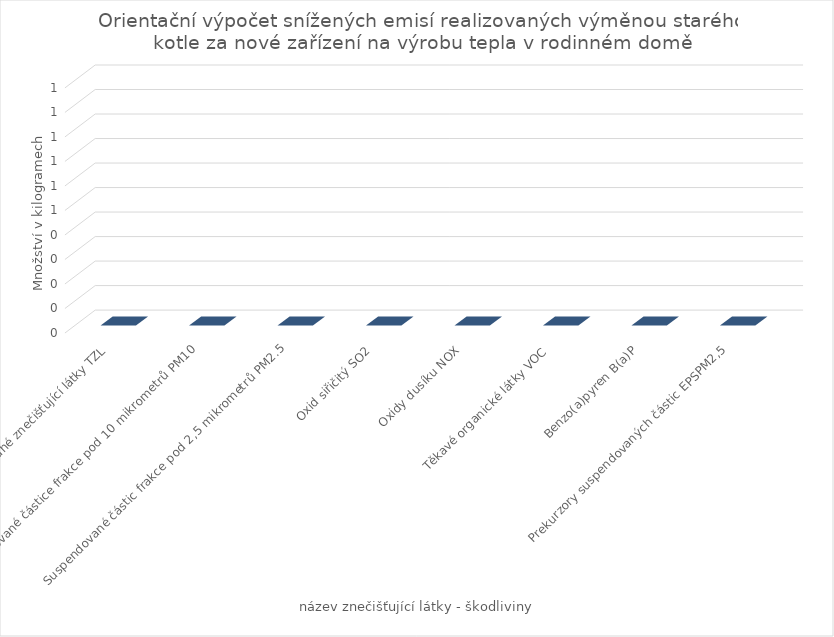
| Category | Series 0 |
|---|---|
| Tuhé znečišťující látky TZL | 0 |
| Suspendované částice frakce pod 10 mikrometrů PM10 | 0 |
| Suspendované částic frakce pod 2,5 mikrometrů PM2.5 | 0 |
| Oxid siřičitý SO2 | 0 |
| Oxidy dusíku NOX | 0 |
| Těkavé organické látky VOC | 0 |
| Benzo(a)pyren B(a)P | 0 |
| Prekurzory suspendovaných částic EPSPM2,5 | 0 |